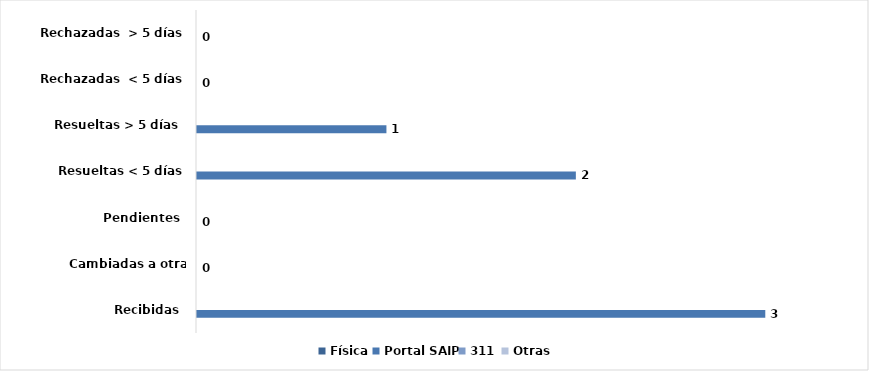
| Category | Física | Portal SAIP | 311 | Otras |
|---|---|---|---|---|
| Recibidas  | 0 | 3 | 0 | 0 |
| Cambiadas a otra Institución | 0 | 0 | 0 | 0 |
| Pendientes  | 0 | 0 | 0 | 0 |
| Resueltas < 5 días | 0 | 2 | 0 | 0 |
| Resueltas > 5 días  | 0 | 1 | 0 | 0 |
| Rechazadas  < 5 días | 0 | 0 | 0 | 0 |
| Rechazadas  > 5 días | 0 | 0 | 0 | 0 |